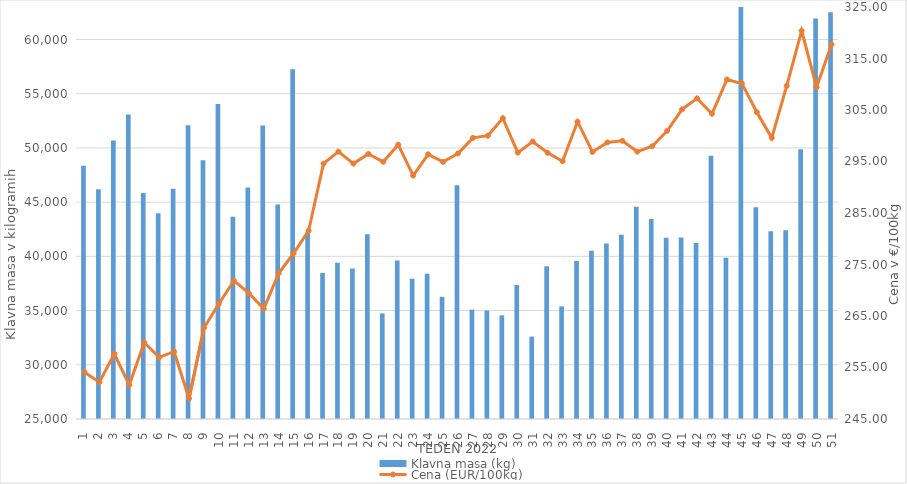
| Category | Klavna masa (kg) |
|---|---|
| 1.0 | 48349 |
| 2.0 | 46187 |
| 3.0 | 50692 |
| 4.0 | 53081 |
| 5.0 | 45844 |
| 6.0 | 43982 |
| 7.0 | 46227 |
| 8.0 | 52099 |
| 9.0 | 48872 |
| 10.0 | 54045 |
| 11.0 | 43645 |
| 12.0 | 46350 |
| 13.0 | 52061 |
| 14.0 | 44774 |
| 15.0 | 57268 |
| 16.0 | 42191 |
| 17.0 | 38469 |
| 18.0 | 39417 |
| 19.0 | 38876 |
| 20.0 | 42047 |
| 21.0 | 34739 |
| 22.0 | 39626 |
| 23.0 | 37939 |
| 24.0 | 38390 |
| 25.0 | 36272 |
| 26.0 | 46553 |
| 27.0 | 35085 |
| 28.0 | 35007 |
| 29.0 | 34559 |
| 30.0 | 37366 |
| 31.0 | 32599 |
| 32.0 | 39100 |
| 33.0 | 35388 |
| 34.0 | 39563 |
| 35.0 | 40507 |
| 36.0 | 41176 |
| 37.0 | 41983 |
| 38.0 | 44572 |
| 39.0 | 43447 |
| 40.0 | 41711 |
| 41.0 | 41736 |
| 42.0 | 41239 |
| 43.0 | 49284 |
| 44.0 | 39877 |
| 45.0 | 63668 |
| 46.0 | 44528 |
| 47.0 | 42319 |
| 48.0 | 42416 |
| 49.0 | 49873 |
| 50.0 | 61942 |
| 51.0 | 62514 |